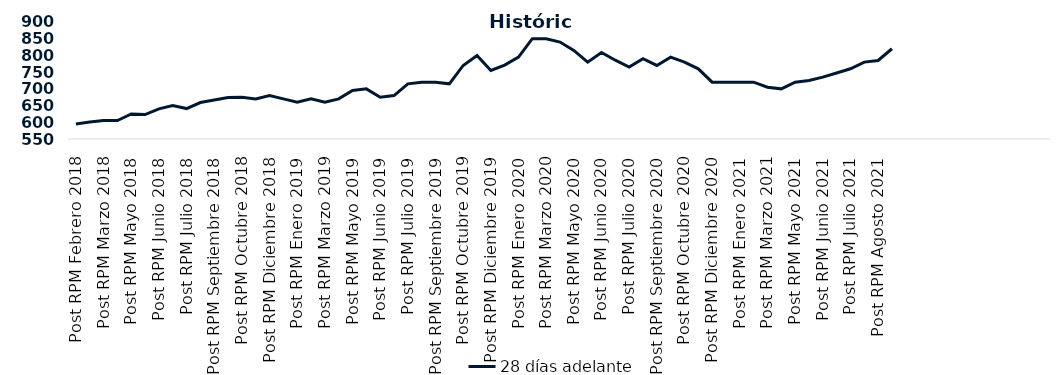
| Category | 28 días adelante |
|---|---|
| Post RPM Febrero 2018 | 595 |
| Pre RPM Marzo 2018 | 601 |
| Post RPM Marzo 2018 | 605 |
| Pre RPM Mayo 2018 | 605 |
| Post RPM Mayo 2018 | 625 |
| Pre RPM Junio 2018 | 623 |
| Post RPM Junio 2018 | 640 |
| Pre RPM Julio 2018 | 650 |
| Post RPM Julio 2018 | 641 |
| Pre RPM Septiembre 2018 | 659 |
| Post RPM Septiembre 2018 | 666.75 |
| Pre RPM Octubre 2018 | 674 |
| Post RPM Octubre 2018 | 675 |
| Pre RPM Diciembre 2018 | 670 |
| Post RPM Diciembre 2018 | 680 |
| Pre RPM Enero 2019 | 670 |
| Post RPM Enero 2019 | 660 |
| Pre RPM Marzo 2019 | 670 |
| Post RPM Marzo 2019 | 660 |
| Pre RPM Mayo 2019 | 670 |
| Post RPM Mayo 2019 | 695 |
| Pre RPM Junio 2019 | 700 |
| Post RPM Junio 2019 | 675 |
| Pre RPM Julio 2019 | 680 |
| Post RPM Julio 2019 | 715 |
| Pre RPM Septiembre 2019 | 720 |
| Post RPM Septiembre 2019 | 720 |
| Pre RPM Octubre 2019 | 715 |
| Post RPM Octubre 2019 | 770 |
| Pre RPM Diciembre 2019 | 800 |
| Post RPM Diciembre 2019 | 755 |
| Pre RPM Enero 2020 | 771 |
| Post RPM Enero 2020 | 795 |
| Pre RPM Marzo 2020 | 850 |
| Post RPM Marzo 2020 | 850 |
| Pre RPM Mayo 2020 | 840 |
| Post RPM Mayo 2020 | 815 |
| Pre RPM Junio 2020 | 780 |
| Post RPM Junio 2020 | 809 |
| Pre RPM Julio 2020 | 785.72 |
| Post RPM Julio 2020 | 765 |
| Pre RPM Septiembre 2020 | 790 |
| Post RPM Septiembre 2020 | 770 |
| Pre RPM Octubre 2020 | 795 |
| Post RPM Octubre 2020 | 780 |
| Pre RPM Diciembre 2020 | 760 |
| Post RPM Diciembre 2020 | 720 |
| Pre RPM Enero 2021 | 720 |
| Post RPM Enero 2021 | 720 |
| Pre RPM Marzo 2021 | 720 |
| Post RPM Marzo 2021 | 705 |
| Pre RPM Mayo 2021 | 700 |
| Post RPM Mayo 2021 | 720 |
| Pre RPM Junio 2021 | 725 |
| Post RPM Junio 2021 | 735 |
| Pre RPM Julio 2021 | 747.5 |
| Post RPM Julio 2021 | 760 |
| Pre RPM Agosto 2021 | 780 |
| Post RPM Agosto 2021 | 785 |
| Pre RPM Octubre 2021 | 820 |